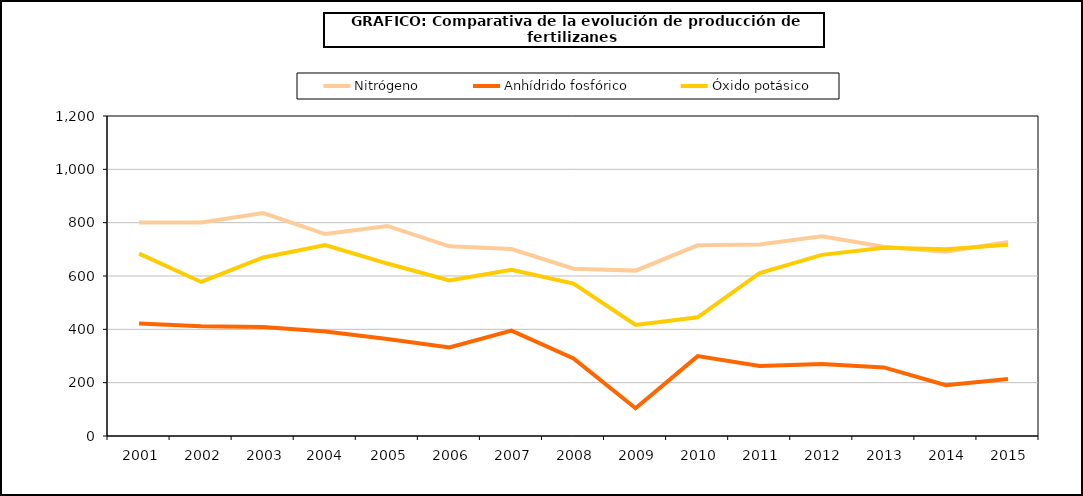
| Category | Nitrógeno | Anhídrido fosfórico | Óxido potásico |
|---|---|---|---|
|   2001 | 800.4 | 421.9 | 684.1 |
|   2002 | 800.5 | 411.4 | 577.7 |
|   2003 | 835.9 | 409.1 | 669.6 |
|   2004  | 757.2 | 391.6 | 715.7 |
|   2005 | 787.7 | 363.889 | 646.714 |
|   2006 | 711.4 | 331.7 | 583.6 |
|   2007 | 701.022 | 394.992 | 623.095 |
|   2008 | 627.3 | 291.1 | 571.7 |
|   2009 | 620.2 | 104.3 | 416.7 |
|   2010 | 715 | 299.5 | 445.3 |
|   2011 | 718.1 | 262.6 | 611.3 |
|   2012 | 748.9 | 269.7 | 679.2 |
|   2013 | 710 | 257.1 | 706.3 |
|   2014 | 691.1 | 190.6 | 700 |
|   2015 | 727.2 | 214 | 717.2 |